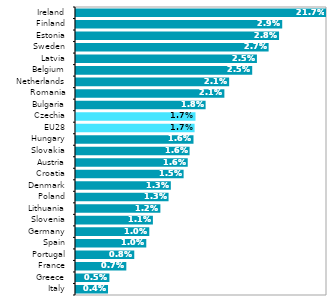
| Category | 2018* |
|---|---|
| Italy | 0.004 |
| Greece | 0.005 |
| France | 0.007 |
| Portugal | 0.008 |
| Spain | 0.01 |
| Germany | 0.01 |
| Slovenia | 0.011 |
| Lithuania | 0.012 |
| Poland | 0.013 |
| Denmark | 0.013 |
| Croatia | 0.015 |
| Austria | 0.016 |
| Slovakia | 0.016 |
| Hungary | 0.016 |
| EU28 | 0.017 |
| Czechia | 0.017 |
| Bulgaria | 0.018 |
| Romania | 0.021 |
| Netherlands | 0.021 |
| Belgium | 0.025 |
| Latvia | 0.025 |
| Sweden | 0.027 |
| Estonia | 0.028 |
| Finland | 0.029 |
| Ireland | 0.217 |